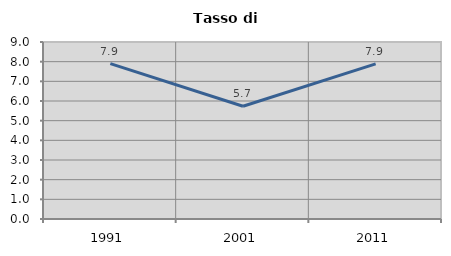
| Category | Tasso di disoccupazione   |
|---|---|
| 1991.0 | 7.898 |
| 2001.0 | 5.734 |
| 2011.0 | 7.886 |